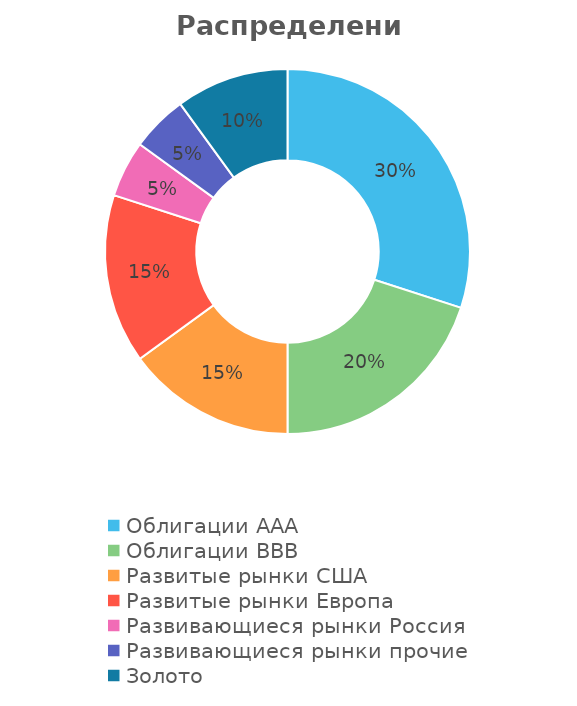
| Category | Series 0 |
|---|---|
| Облигации ААА | 0.3 |
| Облигации ВВВ | 0.2 |
| Развитые рынки США | 0.15 |
| Развитые рынки Европа | 0.15 |
| Развивающиеся рынки Россия | 0.05 |
| Развивающиеся рынки прочие | 0.05 |
| Золото | 0.1 |